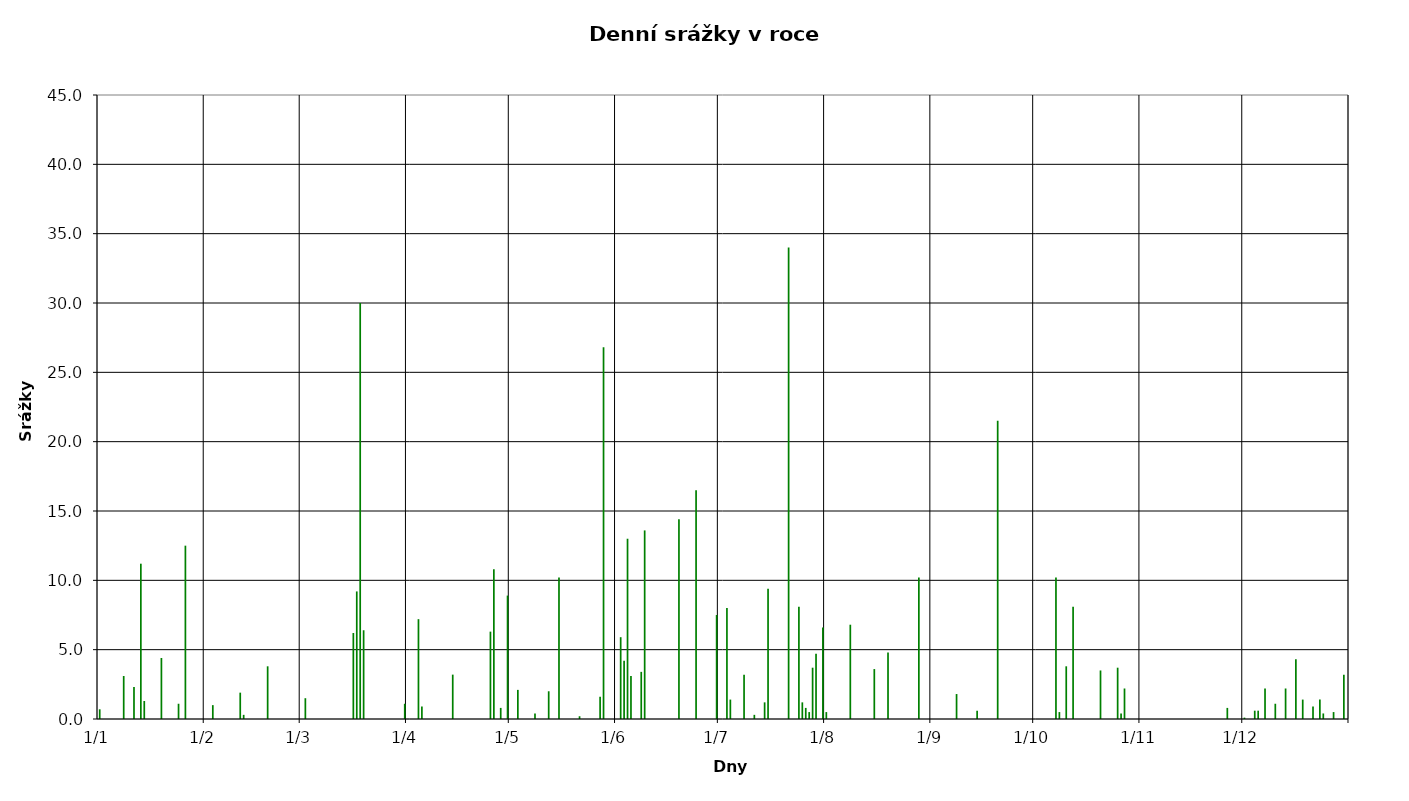
| Category | Series 0 |
|---|---|
| 2011-01-01 | 0.7 |
| 2011-01-02 | 0 |
| 2011-01-03 | 0 |
| 2011-01-04 | 0 |
| 2011-01-05 | 0 |
| 2011-01-06 | 0 |
| 2011-01-07 | 0 |
| 2011-01-08 | 3.1 |
| 2011-01-09 | 0 |
| 2011-01-10 | 0 |
| 2011-01-11 | 2.3 |
| 2011-01-12 | 0 |
| 2011-01-13 | 11.2 |
| 2011-01-14 | 1.3 |
| 2011-01-15 | 0 |
| 2011-01-16 | 0 |
| 2011-01-17 | 0 |
| 2011-01-18 | 0 |
| 2011-01-19 | 4.4 |
| 2011-01-20 | 0 |
| 2011-01-21 | 0 |
| 2011-01-22 | 0 |
| 2011-01-23 | 0 |
| 2011-01-24 | 1.1 |
| 2011-01-25 | 0 |
| 2011-01-26 | 12.5 |
| 2011-01-27 | 0 |
| 2011-01-28 | 0 |
| 2011-01-29 | 0 |
| 2011-01-30 | 0 |
| 2011-01-31 | 0 |
| 2011-02-01 | 0 |
| 2011-02-02 | 0 |
| 2011-02-03 | 1 |
| 2011-02-04 | 0 |
| 2011-02-05 | 0 |
| 2011-02-06 | 0 |
| 2011-02-07 | 0 |
| 2011-02-08 | 0 |
| 2011-02-09 | 0 |
| 2011-02-10 | 0 |
| 2011-02-11 | 1.9 |
| 2011-02-12 | 0.3 |
| 2011-02-13 | 0 |
| 2011-02-14 | 0 |
| 2011-02-15 | 0 |
| 2011-02-16 | 0 |
| 2011-02-17 | 0 |
| 2011-02-18 | 0 |
| 2011-02-19 | 3.8 |
| 2011-02-20 | 0 |
| 2011-02-21 | 0 |
| 2011-02-22 | 0 |
| 2011-02-23 | 0 |
| 2011-02-24 | 0 |
| 2011-02-25 | 0 |
| 2011-02-26 | 0 |
| 2011-02-27 | 0 |
| 2011-02-28 | 0 |
| 2011-03-01 | 0 |
| 2011-03-02 | 1.5 |
| 2011-03-03 | 0 |
| 2011-03-04 | 0 |
| 2011-03-05 | 0 |
| 2011-03-06 | 0 |
| 2011-03-07 | 0 |
| 2011-03-08 | 0 |
| 2011-03-09 | 0 |
| 2011-03-10 | 0 |
| 2011-03-11 | 0 |
| 2011-03-12 | 0 |
| 2011-03-13 | 0 |
| 2011-03-14 | 0 |
| 2011-03-15 | 0 |
| 2011-03-16 | 6.2 |
| 2011-03-17 | 9.2 |
| 2011-03-18 | 30 |
| 2011-03-19 | 6.4 |
| 2011-03-20 | 0 |
| 2011-03-21 | 0 |
| 2011-03-22 | 0 |
| 2011-03-23 | 0 |
| 2011-03-24 | 0 |
| 2011-03-25 | 0 |
| 2011-03-26 | 0 |
| 2011-03-27 | 0 |
| 2011-03-28 | 0 |
| 2011-03-29 | 0 |
| 2011-03-30 | 0 |
| 2011-03-31 | 1.1 |
| 2011-04-01 | 0 |
| 2011-04-02 | 0 |
| 2011-04-03 | 0 |
| 2011-04-04 | 7.2 |
| 2011-04-05 | 0.9 |
| 2011-04-06 | 0 |
| 2011-04-07 | 0 |
| 2011-04-08 | 0 |
| 2011-04-09 | 0 |
| 2011-04-10 | 0 |
| 2011-04-11 | 0 |
| 2011-04-12 | 0 |
| 2011-04-13 | 0 |
| 2011-04-14 | 3.2 |
| 2011-04-15 | 0 |
| 2011-04-16 | 0 |
| 2011-04-17 | 0 |
| 2011-04-18 | 0 |
| 2011-04-19 | 0 |
| 2011-04-20 | 0 |
| 2011-04-21 | 0 |
| 2011-04-22 | 0 |
| 2011-04-23 | 0 |
| 2011-04-24 | 0 |
| 2011-04-25 | 6.3 |
| 2011-04-26 | 10.8 |
| 2011-04-27 | 0 |
| 2011-04-28 | 0.8 |
| 2011-04-29 | 0 |
| 2011-04-30 | 8.9 |
| 2011-05-01 | 0 |
| 2011-05-02 | 0 |
| 2011-05-03 | 2.1 |
| 2011-05-04 | 0 |
| 2011-05-05 | 0 |
| 2011-05-06 | 0 |
| 2011-05-07 | 0 |
| 2011-05-08 | 0.4 |
| 2011-05-09 | 0 |
| 2011-05-10 | 0 |
| 2011-05-11 | 0 |
| 2011-05-12 | 2 |
| 2011-05-13 | 0 |
| 2011-05-14 | 0 |
| 2011-05-15 | 10.2 |
| 2011-05-16 | 0 |
| 2011-05-17 | 0 |
| 2011-05-18 | 0 |
| 2011-05-19 | 0 |
| 2011-05-20 | 0 |
| 2011-05-21 | 0.2 |
| 2011-05-22 | 0 |
| 2011-05-23 | 0 |
| 2011-05-24 | 0 |
| 2011-05-25 | 0 |
| 2011-05-26 | 0 |
| 2011-05-27 | 1.6 |
| 2011-05-28 | 26.8 |
| 2011-05-29 | 0 |
| 2011-05-30 | 0 |
| 2011-05-31 | 0 |
| 2011-06-01 | 0 |
| 2011-06-02 | 5.9 |
| 2011-06-03 | 4.2 |
| 2011-06-04 | 13 |
| 2011-06-05 | 3.1 |
| 2011-06-06 | 0 |
| 2011-06-07 | 0 |
| 2011-06-08 | 3.4 |
| 2011-06-09 | 13.6 |
| 2011-06-10 | 0 |
| 2011-06-11 | 0 |
| 2011-06-12 | 0 |
| 2011-06-13 | 0 |
| 2011-06-14 | 0 |
| 2011-06-15 | 0 |
| 2011-06-16 | 0 |
| 2011-06-17 | 0 |
| 2011-06-18 | 0 |
| 2011-06-19 | 14.4 |
| 2011-06-20 | 0 |
| 2011-06-21 | 0 |
| 2011-06-22 | 0 |
| 2011-06-23 | 0 |
| 2011-06-24 | 16.5 |
| 2011-06-25 | 0 |
| 2011-06-26 | 0 |
| 2011-06-27 | 0 |
| 2011-06-28 | 0 |
| 2011-06-29 | 0 |
| 2011-06-30 | 7.5 |
| 2011-07-01 | 0 |
| 2011-07-02 | 0 |
| 2011-07-03 | 8 |
| 2011-07-04 | 1.4 |
| 2011-07-05 | 0 |
| 2011-07-06 | 0 |
| 2011-07-07 | 0 |
| 2011-07-08 | 3.2 |
| 2011-07-09 | 0 |
| 2011-07-10 | 0 |
| 2011-07-11 | 0.3 |
| 2011-07-12 | 0 |
| 2011-07-13 | 0 |
| 2011-07-14 | 1.2 |
| 2011-07-15 | 9.4 |
| 2011-07-16 | 0 |
| 2011-07-17 | 0 |
| 2011-07-18 | 0 |
| 2011-07-19 | 0 |
| 2011-07-20 | 0 |
| 2011-07-21 | 34 |
| 2011-07-22 | 0 |
| 2011-07-23 | 0 |
| 2011-07-24 | 8.1 |
| 2011-07-25 | 1.2 |
| 2011-07-26 | 0.8 |
| 2011-07-27 | 0.5 |
| 2011-07-28 | 3.7 |
| 2011-07-29 | 4.7 |
| 2011-07-30 | 0 |
| 2011-07-31 | 6.6 |
| 2011-08-01 | 0.5 |
| 2011-08-02 | 0 |
| 2011-08-03 | 0 |
| 2011-08-04 | 0 |
| 2011-08-05 | 0 |
| 2011-08-06 | 0 |
| 2011-08-07 | 0 |
| 2011-08-08 | 6.8 |
| 2011-08-09 | 0 |
| 2011-08-10 | 0 |
| 2011-08-11 | 0 |
| 2011-08-12 | 0 |
| 2011-08-13 | 0 |
| 2011-08-14 | 0 |
| 2011-08-15 | 3.6 |
| 2011-08-16 | 0 |
| 2011-08-17 | 0 |
| 2011-08-18 | 0 |
| 2011-08-19 | 4.8 |
| 2011-08-20 | 0 |
| 2011-08-21 | 0 |
| 2011-08-22 | 0 |
| 2011-08-23 | 0 |
| 2011-08-24 | 0 |
| 2011-08-25 | 0 |
| 2011-08-26 | 0 |
| 2011-08-27 | 0 |
| 2011-08-28 | 10.2 |
| 2011-08-29 | 0 |
| 2011-08-30 | 0 |
| 2011-08-31 | 0 |
| 2011-09-01 | 0 |
| 2011-09-02 | 0 |
| 2011-09-03 | 0 |
| 2011-09-04 | 0 |
| 2011-09-05 | 0 |
| 2011-09-06 | 0 |
| 2011-09-07 | 0 |
| 2011-09-08 | 1.8 |
| 2011-09-09 | 0 |
| 2011-09-10 | 0 |
| 2011-09-11 | 0 |
| 2011-09-12 | 0 |
| 2011-09-13 | 0 |
| 2011-09-14 | 0.6 |
| 2011-09-15 | 0 |
| 2011-09-16 | 0 |
| 2011-09-17 | 0 |
| 2011-09-18 | 0 |
| 2011-09-19 | 0 |
| 2011-09-20 | 21.5 |
| 2011-09-21 | 0 |
| 2011-09-22 | 0 |
| 2011-09-23 | 0 |
| 2011-09-24 | 0 |
| 2011-09-25 | 0 |
| 2011-09-26 | 0 |
| 2011-09-27 | 0 |
| 2011-09-28 | 0 |
| 2011-09-29 | 0 |
| 2011-09-30 | 0 |
| 2011-10-01 | 0 |
| 2011-10-02 | 0 |
| 2011-10-03 | 0 |
| 2011-10-04 | 0 |
| 2011-10-05 | 0 |
| 2011-10-06 | 0 |
| 2011-10-07 | 10.2 |
| 2011-10-08 | 0.5 |
| 2011-10-09 | 0 |
| 2011-10-10 | 3.8 |
| 2011-10-11 | 0 |
| 2011-10-12 | 8.1 |
| 2011-10-13 | 0 |
| 2011-10-14 | 0 |
| 2011-10-15 | 0 |
| 2011-10-16 | 0 |
| 2011-10-17 | 0 |
| 2011-10-18 | 0 |
| 2011-10-19 | 0 |
| 2011-10-20 | 3.5 |
| 2011-10-21 | 0 |
| 2011-10-22 | 0 |
| 2011-10-23 | 0 |
| 2011-10-24 | 0 |
| 2011-10-25 | 3.7 |
| 2011-10-26 | 0.4 |
| 2011-10-27 | 2.2 |
| 2011-10-28 | 0 |
| 2011-10-29 | 0 |
| 2011-10-30 | 0 |
| 2011-10-31 | 0 |
| 2011-11-01 | 0 |
| 2011-11-02 | 0 |
| 2011-11-03 | 0 |
| 2011-11-04 | 0 |
| 2011-11-05 | 0 |
| 2011-11-06 | 0 |
| 2011-11-07 | 0 |
| 2011-11-08 | 0 |
| 2011-11-09 | 0 |
| 2011-11-10 | 0 |
| 2011-11-11 | 0 |
| 2011-11-12 | 0 |
| 2011-11-13 | 0 |
| 2011-11-14 | 0 |
| 2011-11-15 | 0 |
| 2011-11-16 | 0 |
| 2011-11-17 | 0 |
| 2011-11-18 | 0 |
| 2011-11-19 | 0 |
| 2011-11-20 | 0 |
| 2011-11-21 | 0 |
| 2011-11-22 | 0 |
| 2011-11-23 | 0 |
| 2011-11-24 | 0 |
| 2011-11-25 | 0 |
| 2011-11-26 | 0.8 |
| 2011-11-27 | 0 |
| 2011-11-28 | 0 |
| 2011-11-29 | 0 |
| 2011-11-30 | 0 |
| 2011-12-01 | 0.1 |
| 2011-12-02 | 0 |
| 2011-12-03 | 0 |
| 2011-12-04 | 0.6 |
| 2011-12-05 | 0.6 |
| 2011-12-06 | 0 |
| 2011-12-07 | 2.2 |
| 2011-12-08 | 0 |
| 2011-12-09 | 0 |
| 2011-12-10 | 1.1 |
| 2011-12-11 | 0 |
| 2011-12-12 | 0 |
| 2011-12-13 | 2.2 |
| 2011-12-14 | 0 |
| 2011-12-15 | 0 |
| 2011-12-16 | 4.3 |
| 2011-12-17 | 0 |
| 2011-12-18 | 1.4 |
| 2011-12-19 | 0 |
| 2011-12-20 | 0 |
| 2011-12-21 | 0.9 |
| 2011-12-22 | 0 |
| 2011-12-23 | 1.4 |
| 2011-12-24 | 0.4 |
| 2011-12-25 | 0 |
| 2011-12-26 | 0 |
| 2011-12-27 | 0.5 |
| 2011-12-28 | 0 |
| 2011-12-29 | 0 |
| 2011-12-30 | 3.2 |
| 2011-12-31 | 0 |